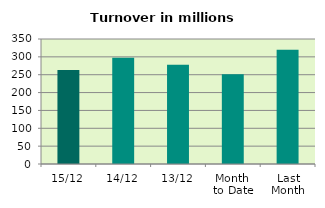
| Category | Series 0 |
|---|---|
| 15/12 | 263.539 |
| 14/12 | 297.335 |
| 13/12 | 277.838 |
| Month 
to Date | 251.155 |
| Last
Month | 319.611 |